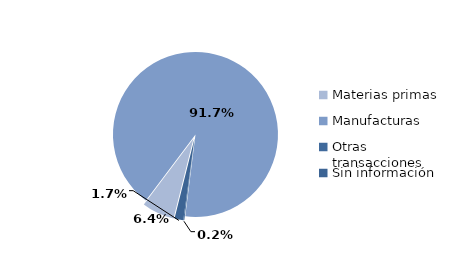
| Category | Series 0 |
|---|---|
| Materias primas | 1202.997 |
| Manufacturas | 17256.44 |
| Otras transacciones | 35.429 |
| Sin información | 324.112 |